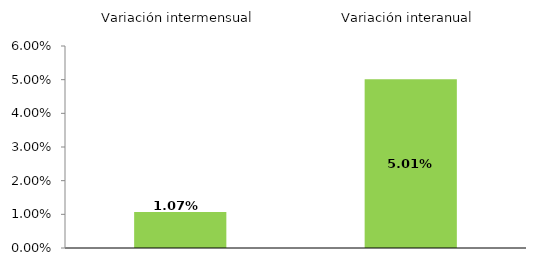
| Category | Series 0 |
|---|---|
| 0 | 1.067 |
| 1 | 5.011 |